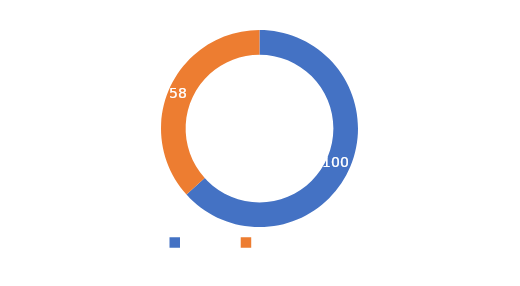
| Category | Series 0 |
|---|---|
| META  | 100 |
| CUMPLIMIENTO | 58 |